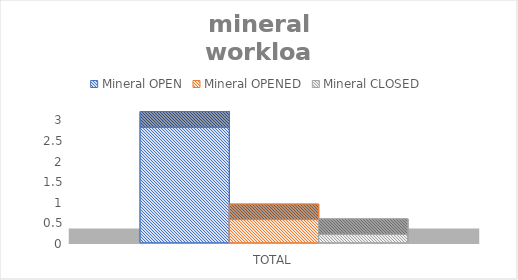
| Category | Mineral |
|---|---|
| TOTAL | 0.204 |